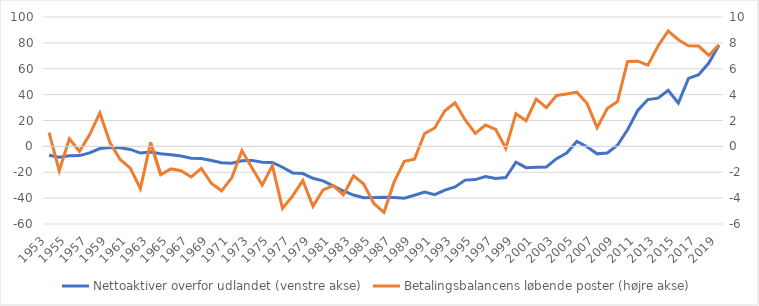
| Category | Nettoaktiver overfor udlandet (venstre akse) |
|---|---|
| 1953.0 | -6.895 |
| 1954.0 | -8.312 |
| 1955.0 | -7.322 |
| 1956.0 | -7.125 |
| 1957.0 | -5.08 |
| 1958.0 | -1.645 |
| 1959.0 | -0.865 |
| 1960.0 | -1.034 |
| 1961.0 | -2.373 |
| 1962.0 | -5.183 |
| 1963.0 | -4.292 |
| 1964.0 | -5.724 |
| 1965.0 | -6.442 |
| 1966.0 | -7.445 |
| 1967.0 | -9.183 |
| 1968.0 | -9.316 |
| 1969.0 | -10.85 |
| 1970.0 | -12.585 |
| 1971.0 | -13.045 |
| 1972.0 | -11.163 |
| 1973.0 | -10.831 |
| 1974.0 | -12.249 |
| 1975.0 | -12.401 |
| 1976.0 | -16.149 |
| 1977.0 | -20.52 |
| 1978.0 | -21.042 |
| 1979.0 | -24.681 |
| 1980.0 | -26.673 |
| 1981.0 | -30.464 |
| 1982.0 | -34.47 |
| 1983.0 | -37.636 |
| 1984.0 | -39.672 |
| 1985.0 | -39.589 |
| 1986.0 | -39.31 |
| 1987.0 | -39.434 |
| 1988.0 | -40.024 |
| 1989.0 | -37.797 |
| 1990.0 | -35.289 |
| 1991.0 | -37.28 |
| 1992.0 | -33.802 |
| 1993.0 | -31.342 |
| 1994.0 | -26.075 |
| 1995.0 | -25.664 |
| 1996.0 | -23.253 |
| 1997.0 | -24.866 |
| 1998.0 | -24.031 |
| 1999.0 | -12.243 |
| 2000.0 | -16.429 |
| 2001.0 | -16.113 |
| 2002.0 | -15.954 |
| 2003.0 | -9.535 |
| 2004.0 | -5.182 |
| 2005.0 | 3.78 |
| 2006.0 | -0.287 |
| 2007.0 | -5.774 |
| 2008.0 | -5.103 |
| 2009.0 | 0.851 |
| 2010.0 | 12.825 |
| 2011.0 | 27.75 |
| 2012.0 | 36.175 |
| 2013.0 | 37.304 |
| 2014.0 | 43.33 |
| 2015.0 | 33.415 |
| 2016.0 | 52.559 |
| 2017.0 | 55.443 |
| 2018.0 | 64.401 |
| 2019.0 | 78.125 |